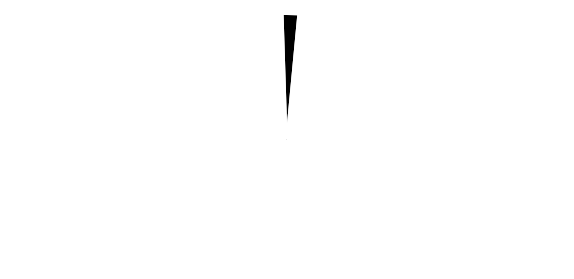
| Category | Series 0 |
|---|---|
| Poloha ručičky | 24.5 |
| Ručička | 2 |
| Zbytek | 73.5 |